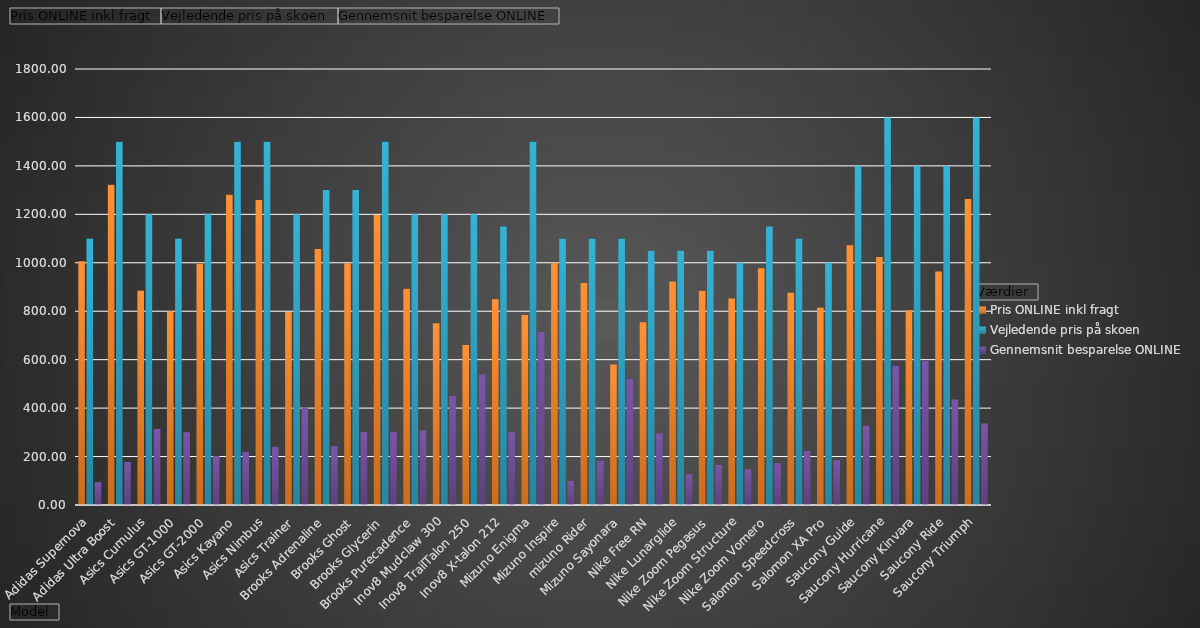
| Category | Pris ONLINE inkl fragt | Vejledende pris på skoen | Gennemsnit besparelse ONLINE |
|---|---|---|---|
| Adidas Supernova | 1005.889 | 1100 | 94.111 |
| Adidas Ultra Boost | 1321.634 | 1500 | 178.366 |
| Asics Cumulus | 885.152 | 1200 | 314.848 |
| Asics GT-1000 | 799.44 | 1100 | 300.56 |
| Asics GT-2000 | 996.653 | 1200 | 203.347 |
| Asics Kayano | 1280.477 | 1500 | 219.523 |
| Asics Nimbus | 1259.003 | 1500 | 240.997 |
| Asics Trainer | 796.56 | 1200 | 403.44 |
| Brooks Adrenaline | 1056.981 | 1300 | 243.019 |
| Brooks Ghost | 998.389 | 1300 | 301.611 |
| Brooks Glycerin | 1197.05 | 1500 | 302.95 |
| Brooks Purecadence | 892.321 | 1200 | 307.679 |
| Inov8 Mudclaw 300 | 749.842 | 1200 | 450.158 |
| Inov8 TrailTalon 250 | 660.757 | 1200 | 539.243 |
| Inov8 X-talon 212 | 849.715 | 1150 | 300.285 |
| Mizuno Enigma | 784.667 | 1500 | 715.333 |
| Mizuno Inspire | 1000.597 | 1100 | 99.403 |
| mizuno Rider | 916.34 | 1100 | 183.66 |
| Mizuno Sayonara | 580.166 | 1100 | 519.834 |
| Nike Free RN | 754.508 | 1050 | 295.492 |
| Nike Lunarglide | 923.216 | 1050 | 126.784 |
| Nike Zoom Pegasus | 884.878 | 1050 | 165.122 |
| Nike Zoom Structure | 852.7 | 1000 | 147.3 |
| Nike Zoom Vomero | 977.07 | 1150 | 172.93 |
| Salomon Speedcross | 876.987 | 1100 | 223.013 |
| Salomon XA Pro | 814.953 | 1000 | 185.047 |
| Saucony Guide | 1072.125 | 1400 | 327.875 |
| Saucony Hurricane | 1024.196 | 1600 | 575.804 |
| Saucony Kinvara | 803.914 | 1400 | 596.086 |
| Saucony Ride | 964.471 | 1400 | 435.529 |
| Saucony Triumph | 1263.275 | 1600 | 336.725 |